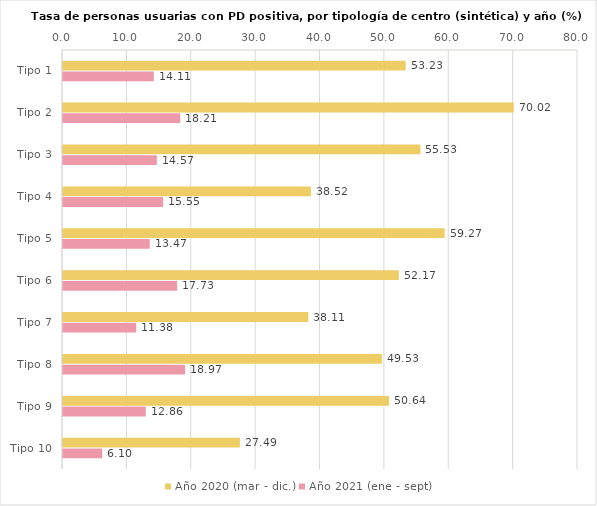
| Category | Año 2020 (mar - dic.) | Año 2021 (ene - sept) |
|---|---|---|
| Tipo 1 | 53.227 | 14.105 |
| Tipo 2 | 70.024 | 18.213 |
| Tipo 3 | 55.529 | 14.574 |
| Tipo 4 | 38.518 | 15.548 |
| Tipo 5 | 59.275 | 13.473 |
| Tipo 6 | 52.174 | 17.726 |
| Tipo 7 | 38.109 | 11.378 |
| Tipo 8 | 49.535 | 18.966 |
| Tipo 9 | 50.644 | 12.86 |
| Tipo 10 | 27.486 | 6.097 |